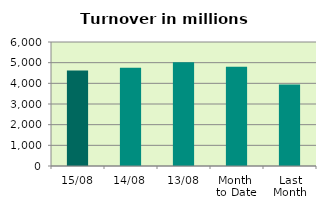
| Category | Series 0 |
|---|---|
| 15/08 | 4626.3 |
| 14/08 | 4752.1 |
| 13/08 | 5017.342 |
| Month 
to Date | 4803.343 |
| Last
Month | 3946.236 |